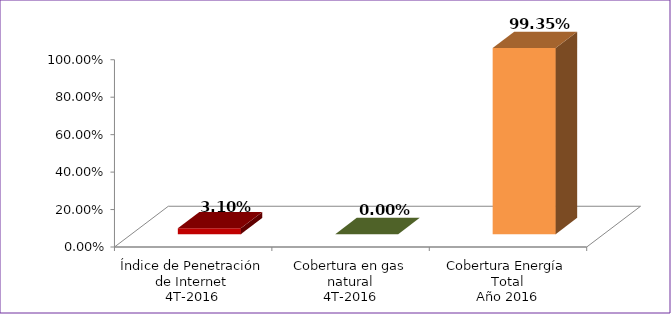
| Category | Series 0 |
|---|---|
| Índice de Penetración de Internet
4T-2016 | 0.031 |
| Cobertura en gas natural
4T-2016 | 0 |
| Cobertura Energía Total
Año 2016 | 0.994 |